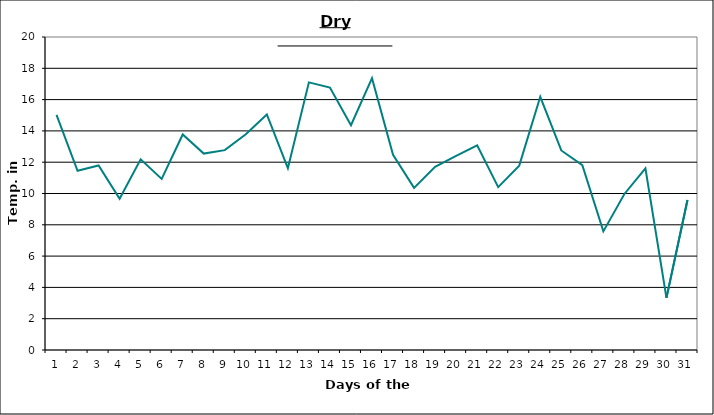
| Category | Series 0 |
|---|---|
| 0 | 15.02 |
| 1 | 11.45 |
| 2 | 11.79 |
| 3 | 9.67 |
| 4 | 12.18 |
| 5 | 10.93 |
| 6 | 13.77 |
| 7 | 12.55 |
| 8 | 12.77 |
| 9 | 13.79 |
| 10 | 15.05 |
| 11 | 11.62 |
| 12 | 17.1 |
| 13 | 16.77 |
| 14 | 14.36 |
| 15 | 17.37 |
| 16 | 12.47 |
| 17 | 10.36 |
| 18 | 11.7 |
| 19 | 12.4 |
| 20 | 13.08 |
| 21 | 10.41 |
| 22 | 11.78 |
| 23 | 16.18 |
| 24 | 12.75 |
| 25 | 11.81 |
| 26 | 7.58 |
| 27 | 9.97 |
| 28 | 11.6 |
| 29 | 3.33 |
| 30 | 9.58 |